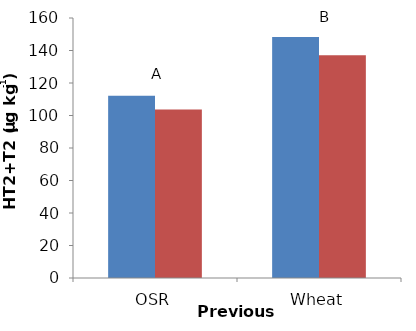
| Category | min-till | plough |
|---|---|---|
| OSR | 112.202 | 103.753 |
| Wheat | 148.252 | 137.088 |